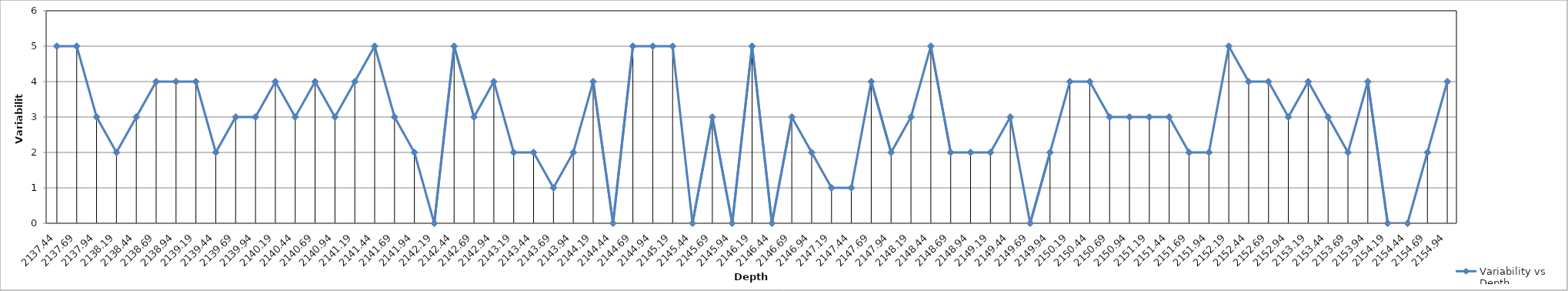
| Category | Variability vs Depth |
|---|---|
| 2137.44 | 5 |
| 2137.69 | 5 |
| 2137.94 | 3 |
| 2138.19 | 2 |
| 2138.44 | 3 |
| 2138.69 | 4 |
| 2138.94 | 4 |
| 2139.19 | 4 |
| 2139.44 | 2 |
| 2139.69 | 3 |
| 2139.94 | 3 |
| 2140.19 | 4 |
| 2140.44 | 3 |
| 2140.69 | 4 |
| 2140.94 | 3 |
| 2141.19 | 4 |
| 2141.44 | 5 |
| 2141.69 | 3 |
| 2141.94 | 2 |
| 2142.19 | 0 |
| 2142.44 | 5 |
| 2142.69 | 3 |
| 2142.94 | 4 |
| 2143.19 | 2 |
| 2143.44 | 2 |
| 2143.69 | 1 |
| 2143.94 | 2 |
| 2144.19 | 4 |
| 2144.44 | 0 |
| 2144.69 | 5 |
| 2144.94 | 5 |
| 2145.19 | 5 |
| 2145.44 | 0 |
| 2145.69 | 3 |
| 2145.94 | 0 |
| 2146.19 | 5 |
| 2146.44 | 0 |
| 2146.69 | 3 |
| 2146.94 | 2 |
| 2147.19 | 1 |
| 2147.44 | 1 |
| 2147.69 | 4 |
| 2147.94 | 2 |
| 2148.19 | 3 |
| 2148.44 | 5 |
| 2148.69 | 2 |
| 2148.94 | 2 |
| 2149.19 | 2 |
| 2149.44 | 3 |
| 2149.69 | 0 |
| 2149.94 | 2 |
| 2150.19 | 4 |
| 2150.44 | 4 |
| 2150.69 | 3 |
| 2150.94 | 3 |
| 2151.19 | 3 |
| 2151.44 | 3 |
| 2151.69 | 2 |
| 2151.94 | 2 |
| 2152.19 | 5 |
| 2152.44 | 4 |
| 2152.69 | 4 |
| 2152.94 | 3 |
| 2153.19 | 4 |
| 2153.44 | 3 |
| 2153.69 | 2 |
| 2153.94 | 4 |
| 2154.19 | 0 |
| 2154.44 | 0 |
| 2154.69 | 2 |
| 2154.94 | 4 |